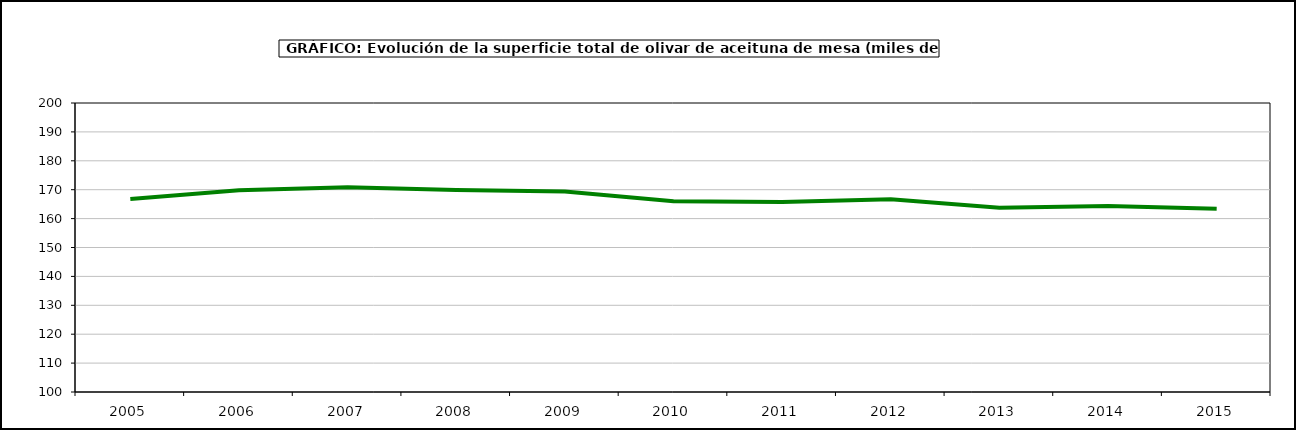
| Category | superficie |
|---|---|
| 2005.0 | 166.808 |
| 2006.0 | 169.828 |
| 2007.0 | 170.84 |
| 2008.0 | 169.892 |
| 2009.0 | 169.372 |
| 2010.0 | 166.006 |
| 2011.0 | 165.762 |
| 2012.0 | 166.679 |
| 2013.0 | 163.795 |
| 2014.0 | 164.379 |
| 2015.0 | 163.414 |